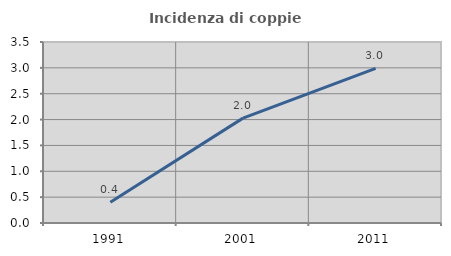
| Category | Incidenza di coppie miste |
|---|---|
| 1991.0 | 0.399 |
| 2001.0 | 2.028 |
| 2011.0 | 2.99 |